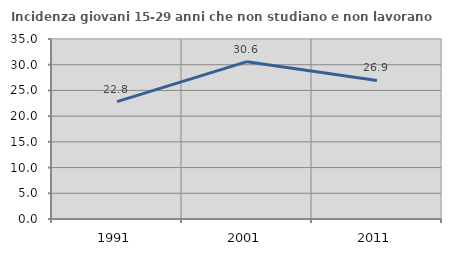
| Category | Incidenza giovani 15-29 anni che non studiano e non lavorano  |
|---|---|
| 1991.0 | 22.83 |
| 2001.0 | 30.594 |
| 2011.0 | 26.943 |